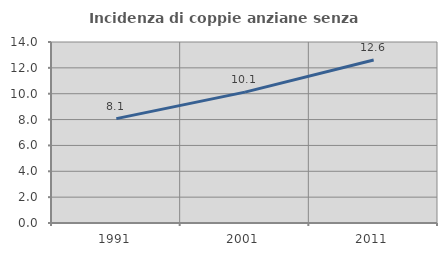
| Category | Incidenza di coppie anziane senza figli  |
|---|---|
| 1991.0 | 8.075 |
| 2001.0 | 10.122 |
| 2011.0 | 12.603 |